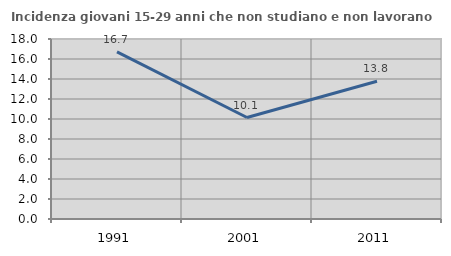
| Category | Incidenza giovani 15-29 anni che non studiano e non lavorano  |
|---|---|
| 1991.0 | 16.713 |
| 2001.0 | 10.149 |
| 2011.0 | 13.768 |